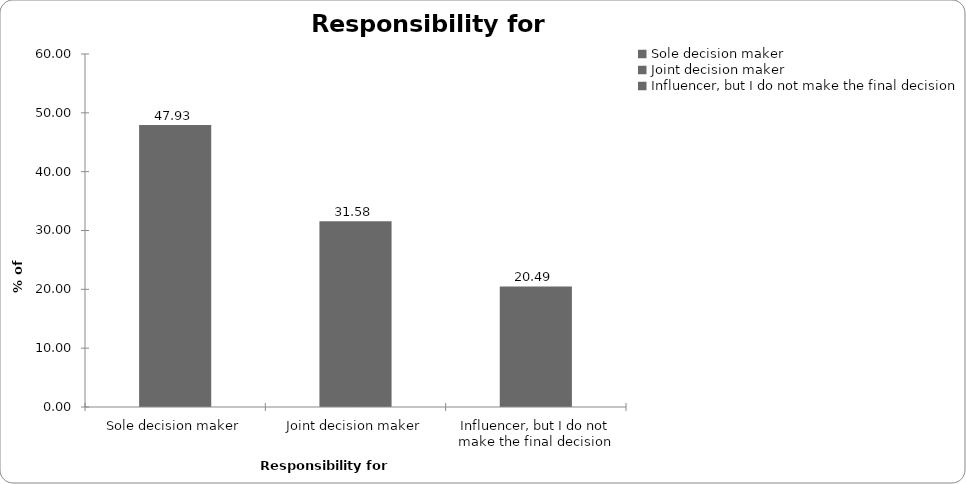
| Category | Responsibility for insurance |
|---|---|
| Sole decision maker | 47.931 |
| Joint decision maker | 31.575 |
| Influencer, but I do not make the final decision | 20.494 |